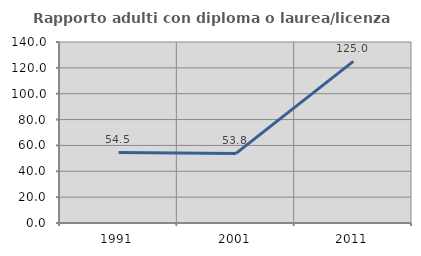
| Category | Rapporto adulti con diploma o laurea/licenza media  |
|---|---|
| 1991.0 | 54.545 |
| 2001.0 | 53.846 |
| 2011.0 | 125 |